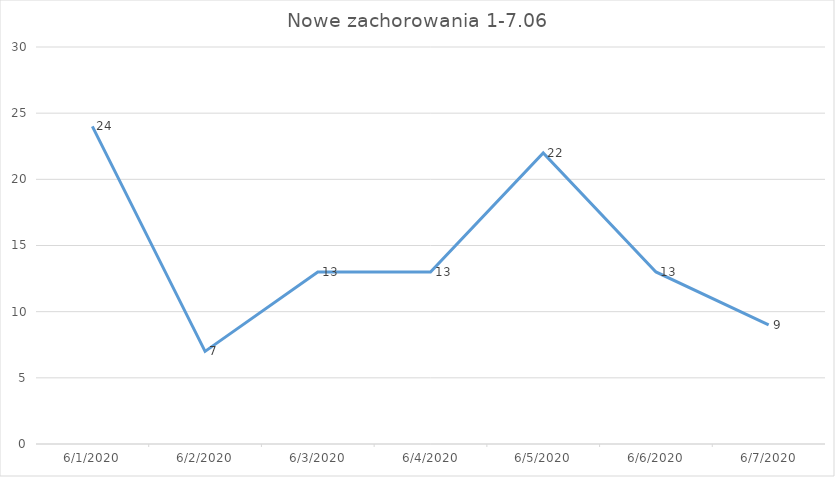
| Category | Series 0 |
|---|---|
| 6/1/20 | 24 |
| 6/2/20 | 7 |
| 6/3/20 | 13 |
| 6/4/20 | 13 |
| 6/5/20 | 22 |
| 6/6/20 | 13 |
| 6/7/20 | 9 |